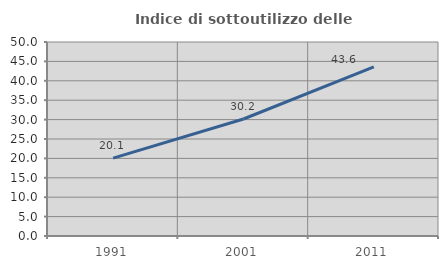
| Category | Indice di sottoutilizzo delle abitazioni  |
|---|---|
| 1991.0 | 20.055 |
| 2001.0 | 30.156 |
| 2011.0 | 43.577 |